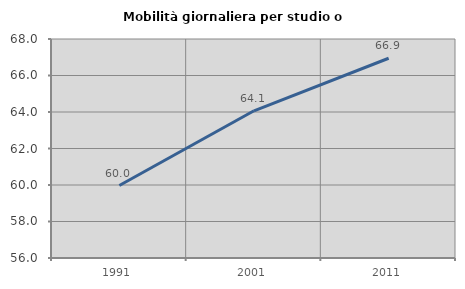
| Category | Mobilità giornaliera per studio o lavoro |
|---|---|
| 1991.0 | 59.97 |
| 2001.0 | 64.066 |
| 2011.0 | 66.945 |